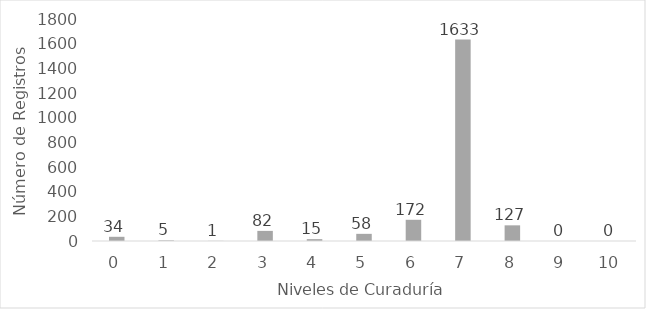
| Category | # de indv por nivel |
|---|---|
| 0.0 | 34 |
| 1.0 | 5 |
| 2.0 | 1 |
| 3.0 | 82 |
| 4.0 | 15 |
| 5.0 | 58 |
| 6.0 | 172 |
| 7.0 | 1633 |
| 8.0 | 127 |
| 9.0 | 0 |
| 10.0 | 0 |